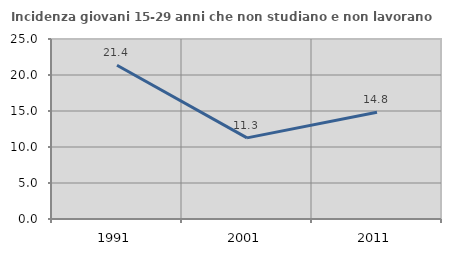
| Category | Incidenza giovani 15-29 anni che non studiano e non lavorano  |
|---|---|
| 1991.0 | 21.361 |
| 2001.0 | 11.265 |
| 2011.0 | 14.823 |